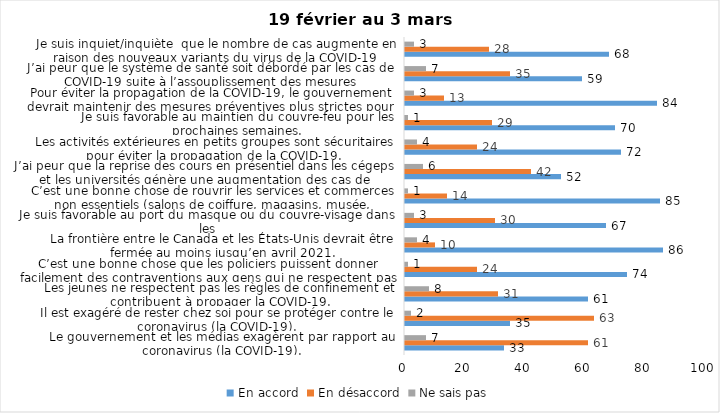
| Category | En accord | En désaccord | Ne sais pas |
|---|---|---|---|
| Le gouvernement et les médias exagèrent par rapport au coronavirus (la COVID-19). | 33 | 61 | 7 |
| Il est exagéré de rester chez soi pour se protéger contre le coronavirus (la COVID-19). | 35 | 63 | 2 |
| Les jeunes ne respectent pas les règles de confinement et contribuent à propager la COVID-19. | 61 | 31 | 8 |
| C’est une bonne chose que les policiers puissent donner facilement des contraventions aux gens qui ne respectent pas les mesures pour prévenir le coronavirus (la COVID-19). | 74 | 24 | 1 |
| La frontière entre le Canada et les États-Unis devrait être fermée au moins jusqu’en avril 2021. | 86 | 10 | 4 |
| Je suis favorable au port du masque ou du couvre-visage dans les
lieux publics extérieurs achalandés (ex. rues, parcs) | 67 | 30 | 3 |
| C’est une bonne chose de rouvrir les services et commerces non essentiels (salons de coiffure, magasins, musée, industries) à partir du 8 février 2021. | 85 | 14 | 1 |
| J’ai peur que la reprise des cours en présentiel dans les cégeps et les universités génère une augmentation des cas de COVID-19. | 52 | 42 | 6 |
| Les activités extérieures en petits groupes sont sécuritaires pour éviter la propagation de la COVID-19. | 72 | 24 | 4 |
| Je suis favorable au maintien du couvre-feu pour les prochaines semaines. | 70 | 29 | 1 |
| Pour éviter la propagation de la COVID-19, le gouvernement devrait maintenir des mesures préventives plus strictes pour la grande région de Montréal. | 84 | 13 | 3 |
| J’ai peur que le système de santé soit débordé par les cas de COVID-19 suite à l’assouplissement des mesures | 59 | 35 | 7 |
| Je suis inquiet/inquiète  que le nombre de cas augmente en raison des nouveaux variants du virus de la COVID-19 | 68 | 28 | 3 |